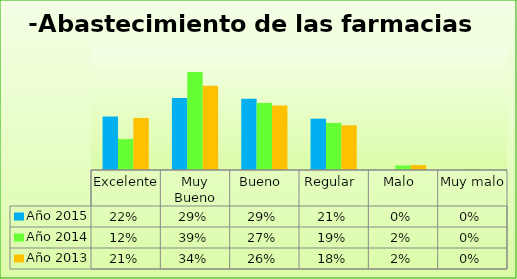
| Category | Año 2015 | Año 2014 | Año 2013 |
|---|---|---|---|
| Excelente | 0.216 | 0.125 | 0.21 |
| Muy Bueno | 0.29 | 0.395 | 0.34 |
| Bueno  | 0.287 | 0.27 | 0.26 |
| Regular  | 0.207 | 0.19 | 0.18 |
| Malo  | 0 | 0.018 | 0.02 |
| Muy malo  | 0 | 0.003 | 0 |